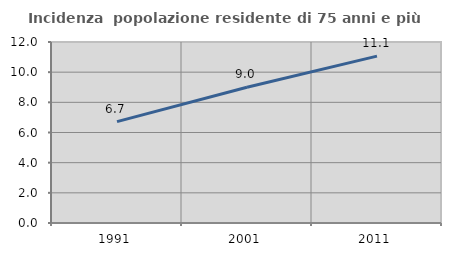
| Category | Incidenza  popolazione residente di 75 anni e più |
|---|---|
| 1991.0 | 6.722 |
| 2001.0 | 9.002 |
| 2011.0 | 11.064 |